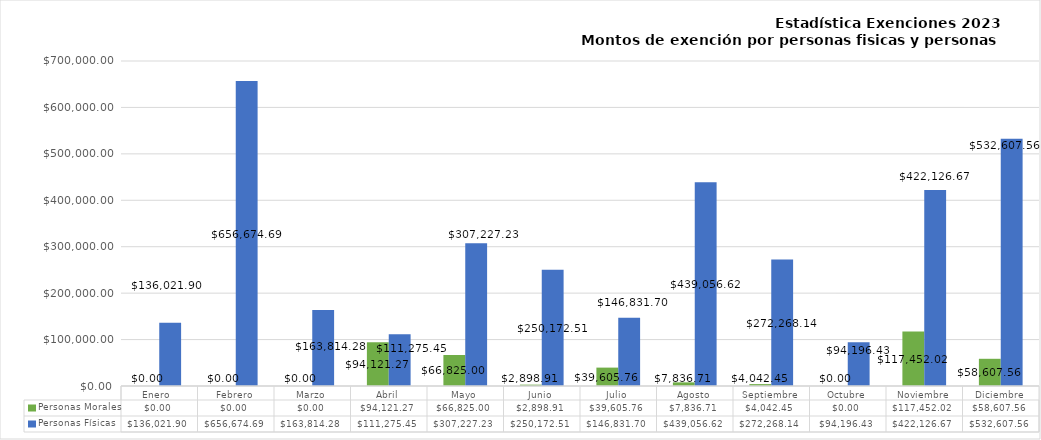
| Category | Personas Morales | Personas Físicas |
|---|---|---|
| Enero  | 0 | 136021.9 |
| Febrero | 0 | 656674.69 |
| Marzo | 0 | 163814.28 |
| Abril | 94121.27 | 111275.45 |
| Mayo | 66825 | 307227.23 |
| Junio | 2898.91 | 250172.51 |
| Julio | 39605.76 | 146831.7 |
| Agosto | 7836.71 | 439056.62 |
| Septiembre | 4042.45 | 272268.14 |
| Octubre | 0 | 94196.43 |
| Noviembre | 117452.02 | 422126.67 |
| Diciembre | 58607.56 | 532607.56 |